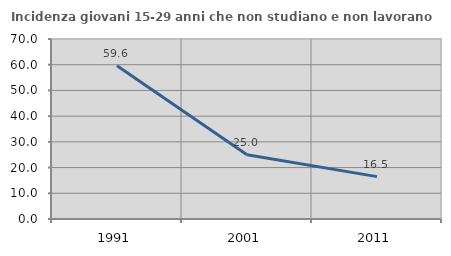
| Category | Incidenza giovani 15-29 anni che non studiano e non lavorano  |
|---|---|
| 1991.0 | 59.569 |
| 2001.0 | 25 |
| 2011.0 | 16.484 |